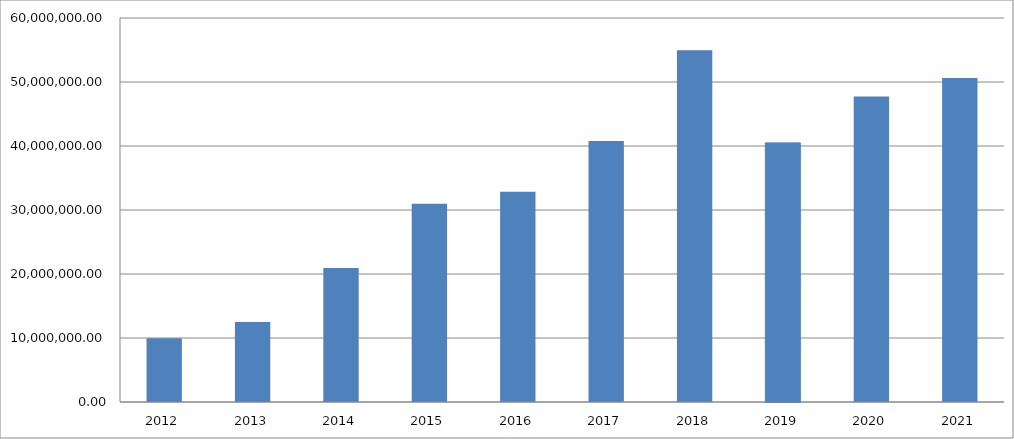
| Category | Series 0 |
|---|---|
| 2012.0 | 9953026.32 |
| 2013.0 | 12498274.46 |
| 2014.0 | 20934956.25 |
| 2015.0 | 30989574.99 |
| 2016.0 | 32855316.81 |
| 2017.0 | 40784574.71 |
| 2018.0 | 54946537.06 |
| 2019.0 | 40487175.58 |
| 2020.0 | 47726062.86 |
| 2021.0 | 50624720.63 |